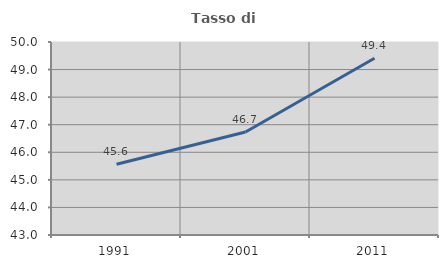
| Category | Tasso di occupazione   |
|---|---|
| 1991.0 | 45.566 |
| 2001.0 | 46.738 |
| 2011.0 | 49.408 |